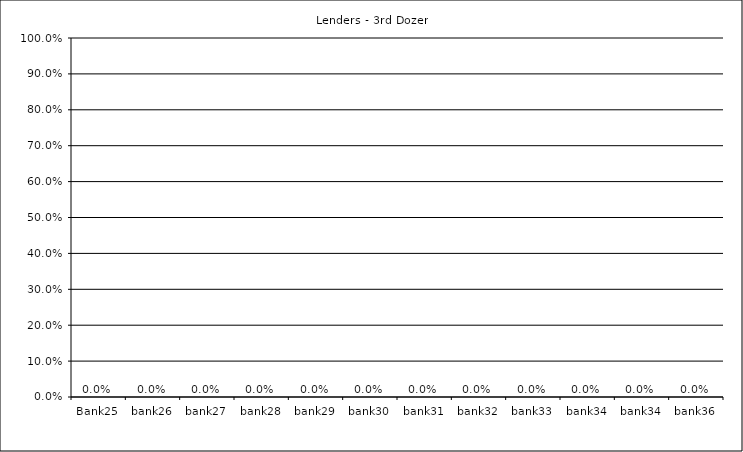
| Category | Lenders - 3rd Dozen |
|---|---|
| Bank25 | 0 |
| bank26 | 0 |
| bank27 | 0 |
| bank28 | 0 |
| bank29 | 0 |
| bank30 | 0 |
| bank31 | 0 |
| bank32 | 0 |
| bank33 | 0 |
| bank34 | 0 |
| bank34 | 0 |
| bank36 | 0 |